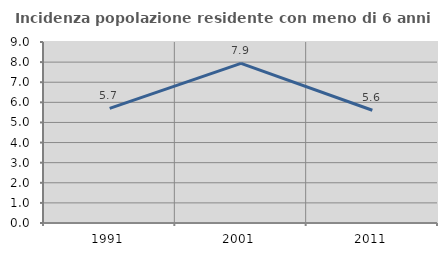
| Category | Incidenza popolazione residente con meno di 6 anni |
|---|---|
| 1991.0 | 5.699 |
| 2001.0 | 7.937 |
| 2011.0 | 5.606 |